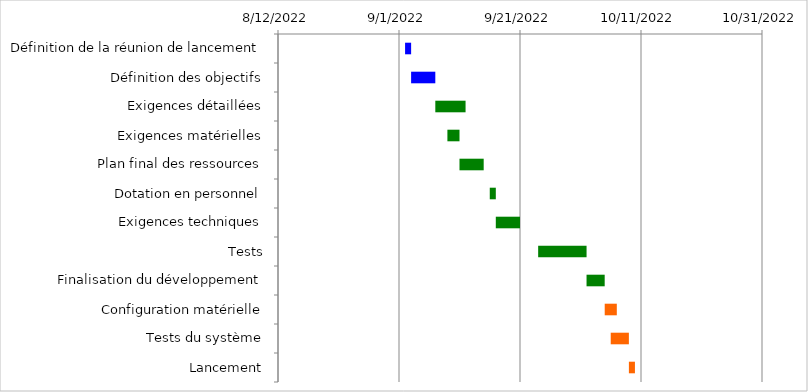
| Category | Début | Jours |
|---|---|---|
| Définition de la réunion de lancement | 9/2/22 | 1 |
| Définition des objectifs | 9/3/22 | 4 |
| Exigences détaillées | 9/7/22 | 5 |
| Exigences matérielles | 9/9/22 | 2 |
| Plan final des ressources | 9/11/22 | 4 |
| Dotation en personnel | 9/16/22 | 1 |
| Exigences techniques | 9/17/22 | 4 |
| Tests | 9/24/22 | 8 |
| Finalisation du développement | 10/2/22 | 3 |
| Configuration matérielle | 10/5/22 | 2 |
| Tests du système | 10/6/22 | 3 |
| Lancement | 10/9/22 | 1 |